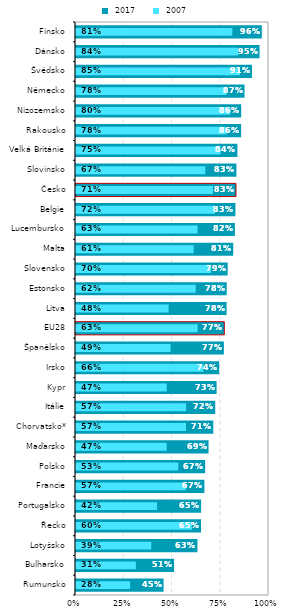
| Category |  2017 |
|---|---|
| Rumunsko | 0.454 |
| Bulharsko | 0.508 |
| Lotyšsko | 0.629 |
| Řecko | 0.648 |
| Portugalsko | 0.648 |
| Francie | 0.665 |
| Polsko | 0.669 |
| Maďarsko | 0.687 |
| Chorvatsko* | 0.711 |
| Itálie | 0.721 |
| Kypr | 0.729 |
| Irsko | 0.742 |
| Španělsko | 0.766 |
| EU28 | 0.768 |
| Litva | 0.78 |
| Estonsko | 0.781 |
| Slovensko | 0.786 |
| Malta | 0.815 |
| Lucembursko | 0.823 |
| Belgie | 0.826 |
| Česko | 0.829 |
| Slovinsko | 0.831 |
| Velká Británie | 0.836 |
| Rakousko | 0.856 |
| Nizozemsko | 0.856 |
| Německo | 0.873 |
| Švédsko | 0.912 |
| Dánsko | 0.951 |
| Finsko | 0.963 |